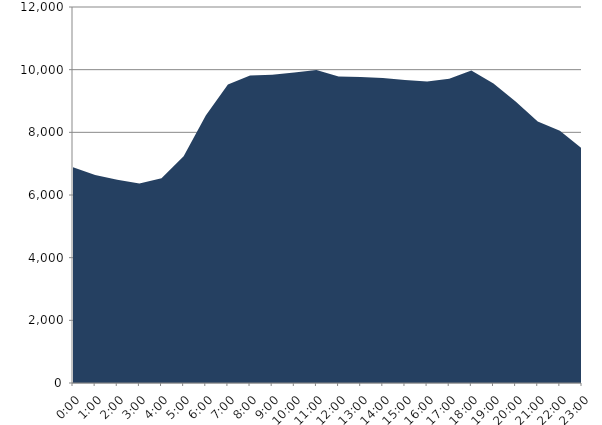
| Category | Series 0 | Series 1 |
|---|---|---|
| 2016-10-19 |  | 6885.262 |
| 2016-10-19 01:00:00 |  | 6641.452 |
| 2016-10-19 02:00:00 |  | 6488.296 |
| 2016-10-19 03:00:00 |  | 6366.921 |
| 2016-10-19 04:00:00 |  | 6536.399 |
| 2016-10-19 05:00:00 |  | 7240.61 |
| 2016-10-19 06:00:00 |  | 8537.546 |
| 2016-10-19 07:00:00 |  | 9530.202 |
| 2016-10-19 08:00:00 |  | 9814.012 |
| 2016-10-19 09:00:00 |  | 9839.67 |
| 2016-10-19 10:00:00 |  | 9912.934 |
| 2016-10-19 11:00:00 |  | 9988.924 |
| 2016-10-19 12:00:00 |  | 9780.729 |
| 2016-10-19 13:00:00 |  | 9766.764 |
| 2016-10-19 14:00:00 |  | 9733.725 |
| 2016-10-19 15:00:00 |  | 9666.9 |
| 2016-10-19 16:00:00 |  | 9621.77 |
| 2016-10-19 17:00:00 |  | 9708.578 |
| 2016-10-19 18:00:00 |  | 9974.563 |
| 2016-10-19 19:00:00 |  | 9561.206 |
| 2016-10-19 20:00:00 |  | 8986.617 |
| 2016-10-19 21:00:00 |  | 8348.898 |
| 2016-10-19 22:00:00 |  | 8048.695 |
| 2016-10-19 23:00:00 |  | 7483.384 |